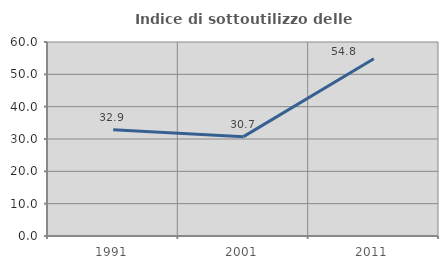
| Category | Indice di sottoutilizzo delle abitazioni  |
|---|---|
| 1991.0 | 32.87 |
| 2001.0 | 30.732 |
| 2011.0 | 54.808 |